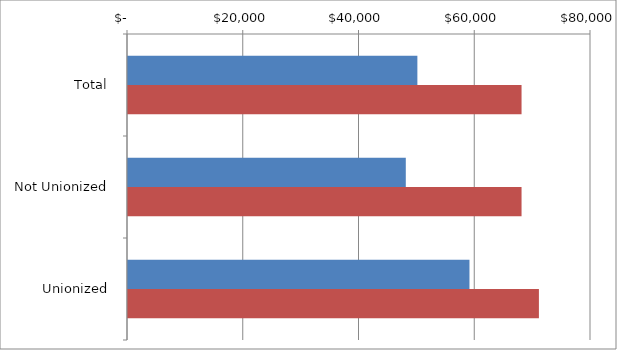
| Category | Series 0 | Series 1 |
|---|---|---|
| Total | 50000 | 68000 |
|  Not Unionized  | 48000 | 68000 |
|  Unionized  | 59000 | 71000 |